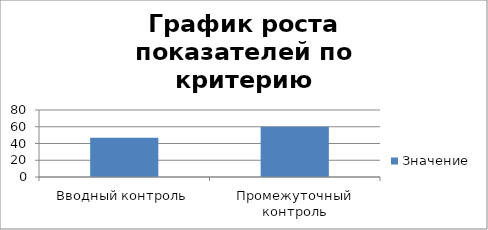
| Category | Значение |
|---|---|
| Вводный контроль | 47 |
| Промежуточный контроль | 60 |